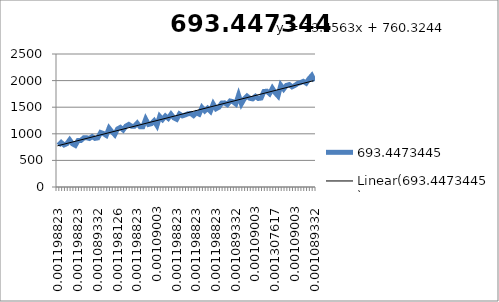
| Category | 693.4473445 |
|---|---|
| 0.00119882335383198 | 783.444 |
| 0.000980538473233265 | 836.439 |
| 0.00119882335383214 | 790.301 |
| 0.00119812595804753 | 813.715 |
| 0.001090029611425 | 885.783 |
| 0.00130761709623927 | 811.583 |
| 0.00130761709623912 | 782.566 |
| 0.00119882335383214 | 874.781 |
| 0.00130761709623927 | 873.989 |
| 0.00130761709623912 | 924.148 |
| 0.000980538473233265 | 925.809 |
| 0.00130761709623927 | 912.127 |
| 0.00119882335383214 | 947.577 |
| 0.00087174473082613 | 914.055 |
| 0.0010893322156404 | 923.513 |
| 0.00119882335383214 | 1023.994 |
| 0.000980538473233265 | 1004.922 |
| 0.001090029611425 | 970.176 |
| 0.00108933221564024 | 1105.262 |
| 0.001090029611425 | 1038.687 |
| 0.00130761709623927 | 983.835 |
| 0.00119812595804753 | 1091.086 |
| 0.001090029611425 | 1120.041 |
| 0.00130761709623912 | 1072.688 |
| 0.00119882335383214 | 1145.735 |
| 0.00130761709623927 | 1175.621 |
| 0.00119812595804738 | 1141.613 |
| 0.00119882335383214 | 1142.326 |
| 0.00119882335383214 | 1200.047 |
| 0.00119882335383214 | 1132.351 |
| 0.000980538473233265 | 1133.926 |
| 0.00119882335383214 | 1275.672 |
| 0.000980538473233265 | 1175.927 |
| 0.00119882335383214 | 1189.256 |
| 0.00108933221564024 | 1244.203 |
| 0.00109002961142516 | 1156.752 |
| 0.00130761709623912 | 1327.155 |
| 0.0010893322156404 | 1268.807 |
| 0.001090029611425 | 1333.65 |
| 0.00130761709623927 | 1290.654 |
| 0.00130761709623912 | 1367.479 |
| 0.0010893322156404 | 1299.289 |
| 0.00119882335383214 | 1273.337 |
| 0.00130761709623927 | 1372.431 |
| 0.00119882335383214 | 1336.942 |
| 0.00130761709623912 | 1353.883 |
| 0.000980538473233265 | 1375.464 |
| 0.000980538473233265 | 1382.438 |
| 0.001090029611425 | 1343.258 |
| 0.00119882335383214 | 1395.304 |
| 0.000980538473233265 | 1369.751 |
| 0.00119812595804738 | 1492.863 |
| 0.00109002961142516 | 1430.175 |
| 0.00119882335383198 | 1480.043 |
| 0.00119812595804753 | 1425.128 |
| 0.00119882335383214 | 1559.775 |
| 0.00119882335383214 | 1470.804 |
| 0.00119882335383214 | 1498.779 |
| 0.00130761709623912 | 1577.704 |
| 0.00130761709623927 | 1581.41 |
| 0.0010893322156404 | 1548.467 |
| 0.00119882335383214 | 1616.186 |
| 0.00119882335383198 | 1603.108 |
| 0.0010893322156404 | 1562.321 |
| 0.00119882335383214 | 1725.985 |
| 0.000980538473233265 | 1564.233 |
| 0.001090029611425 | 1657.012 |
| 0.000980538473233265 | 1708.299 |
| 0.00119882335383214 | 1667.058 |
| 0.00119812595804738 | 1657.177 |
| 0.001090029611425 | 1705.227 |
| 0.00119882335383214 | 1664.159 |
| 0.00119812595804753 | 1672.277 |
| 0.001090029611425 | 1795.028 |
| 0.00130761709623927 | 1800.756 |
| 0.00130761709623912 | 1753.826 |
| 0.00119882335383214 | 1854.801 |
| 0.00130761709623927 | 1771.394 |
| 0.00119812595804738 | 1712.836 |
| 0.00119882335383214 | 1912.639 |
| 0.001090029611425 | 1840.406 |
| 0.000980538473233265 | 1909.418 |
| 0.00119882335383214 | 1924.69 |
| 0.0010893322156404 | 1883.175 |
| 0.001090029611425 | 1908.909 |
| 0.0010893322156404 | 1946.616 |
| 0.00119882335383198 | 1962.821 |
| 0.00119882335383214 | 1985.553 |
| 0.000980538473233265 | 1952.438 |
| 0.00130761709623927 | 2033 |
| 0.00119882335383214 | 2093.565 |
| 0.0010893322156404 | 1992.088 |